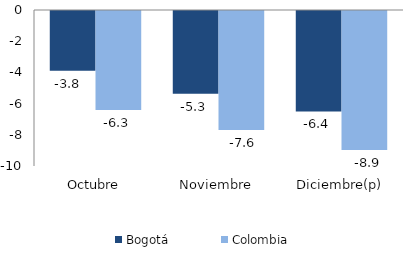
| Category | Bogotá | Colombia |
|---|---|---|
| Octubre | -3.834 | -6.338 |
| Noviembre | -5.309 | -7.632 |
| Diciembre(p) | -6.438 | -8.911 |